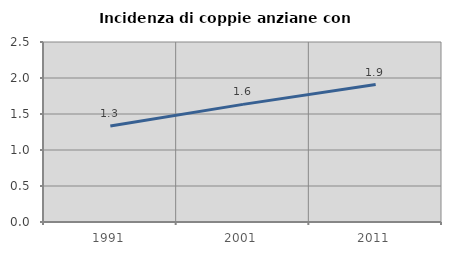
| Category | Incidenza di coppie anziane con figli |
|---|---|
| 1991.0 | 1.333 |
| 2001.0 | 1.634 |
| 2011.0 | 1.909 |